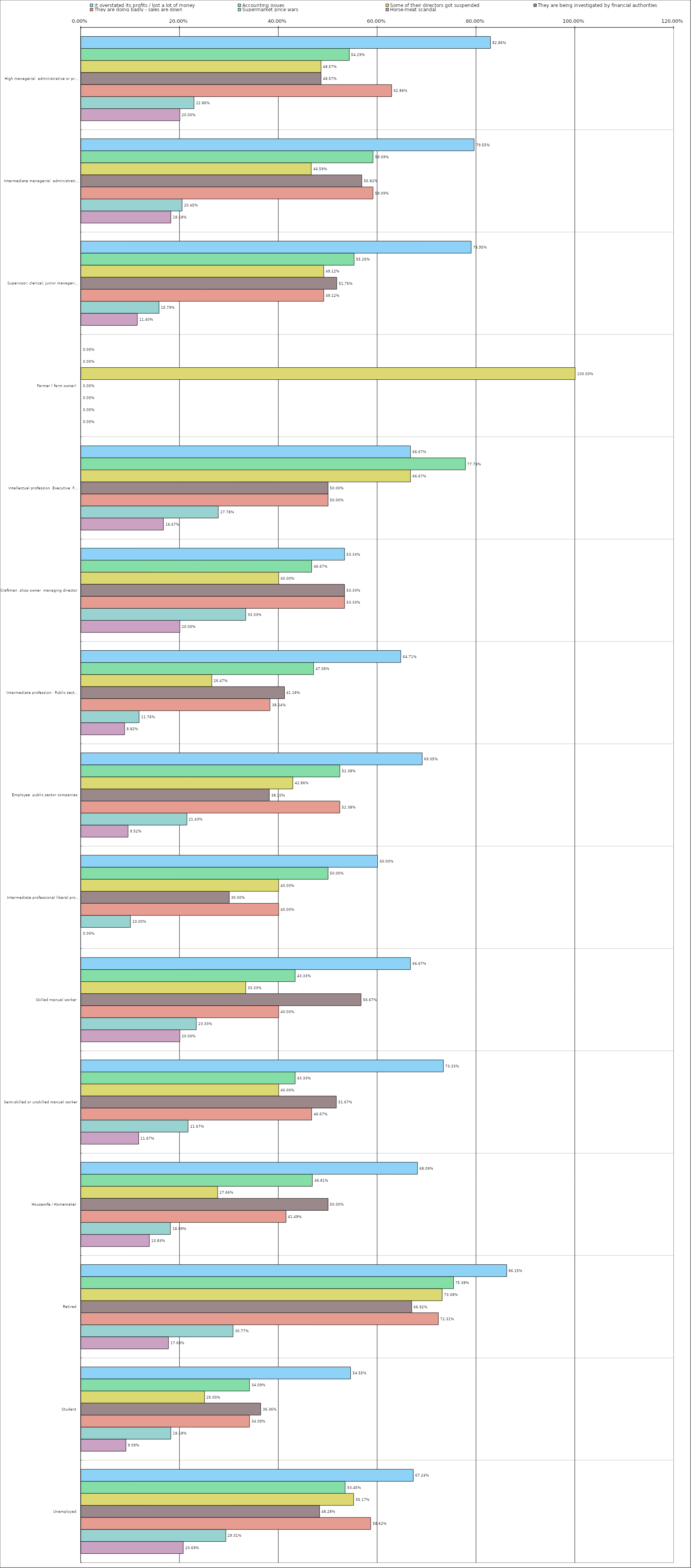
| Category | It overstated its profits / lost a lot of money | Accounting issues | Some of their directors got suspended | They are being investigated by financial authorities | They are doing badly - sales are down | Supermarket price wars | Horse-meat scandal |
|---|---|---|---|---|---|---|---|
| 0 | 0.829 | 0.543 | 0.486 | 0.486 | 0.629 | 0.229 | 0.2 |
| 1 | 0.796 | 0.591 | 0.466 | 0.568 | 0.591 | 0.204 | 0.182 |
| 2 | 0.79 | 0.553 | 0.491 | 0.518 | 0.491 | 0.158 | 0.114 |
| 3 | 0 | 0 | 1 | 0 | 0 | 0 | 0 |
| 4 | 0.667 | 0.778 | 0.667 | 0.5 | 0.5 | 0.278 | 0.167 |
| 5 | 0.533 | 0.467 | 0.4 | 0.533 | 0.533 | 0.333 | 0.2 |
| 6 | 0.647 | 0.471 | 0.265 | 0.412 | 0.382 | 0.118 | 0.088 |
| 7 | 0.69 | 0.524 | 0.429 | 0.381 | 0.524 | 0.214 | 0.095 |
| 8 | 0.6 | 0.5 | 0.4 | 0.3 | 0.4 | 0.1 | 0 |
| 9 | 0.667 | 0.433 | 0.333 | 0.567 | 0.4 | 0.233 | 0.2 |
| 10 | 0.733 | 0.433 | 0.4 | 0.517 | 0.467 | 0.217 | 0.117 |
| 11 | 0.681 | 0.468 | 0.277 | 0.5 | 0.415 | 0.181 | 0.138 |
| 12 | 0.862 | 0.754 | 0.731 | 0.669 | 0.723 | 0.308 | 0.177 |
| 13 | 0.546 | 0.341 | 0.25 | 0.364 | 0.341 | 0.182 | 0.091 |
| 14 | 0.672 | 0.534 | 0.552 | 0.483 | 0.586 | 0.293 | 0.207 |